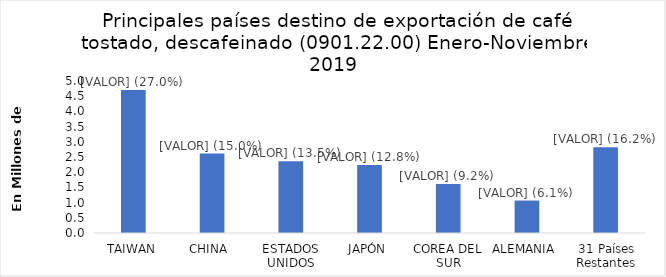
| Category | Series 0 |
|---|---|
| TAIWAN | 4705505 |
| CHINA  | 2612069 |
| ESTADOS UNIDOS | 2357691 |
| JAPÓN | 2233388 |
| COREA DEL SUR | 1608694 |
| ALEMANIA  | 1067702 |
| 31 Países Restantes | 2819815 |